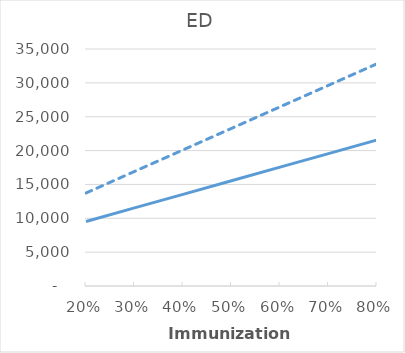
| Category | Low Efficacy, Low RSV Rates | High Efficacy, High RSV Rates |
|---|---|---|
| 0.2 | 9528.777 | 13735.318 |
| 0.30000000000000004 | 11533.651 | 16915.725 |
| 0.4 | 13538.525 | 20096.133 |
| 0.5 | 15543.4 | 23276.54 |
| 0.6 | 17548.274 | 26456.947 |
| 0.7 | 19553.148 | 29637.355 |
| 0.7999999999999999 | 21558.022 | 32817.762 |